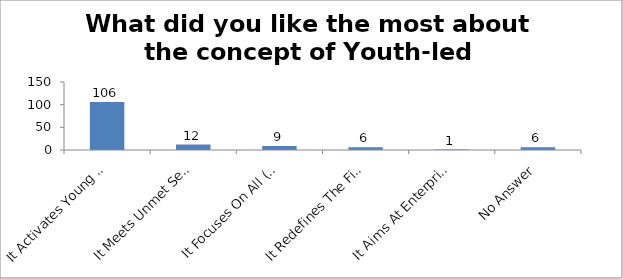
| Category | What did you like the most about the concept of Youth-led Changemaking? |
|---|---|
| It Activates Young People As Changemakers | 106 |
| It Meets Unmet Service Needs Of The Society | 12 |
| It Focuses On All (Troubled And Prepared) Young People | 9 |
| It Redefines The Field Of Youth Development | 6 |
| It Aims At Enterprising Education | 1 |
| No Answer | 6 |